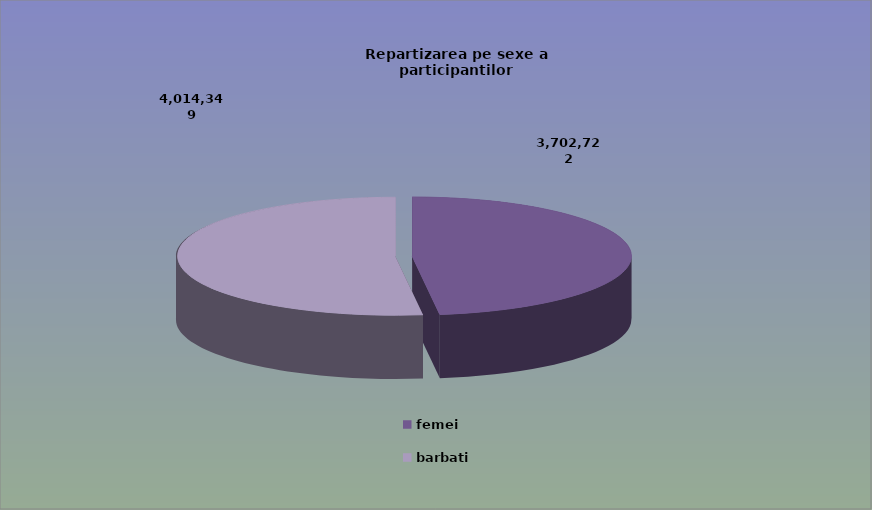
| Category | Series 0 |
|---|---|
| femei | 3702722 |
| barbati | 4014349 |